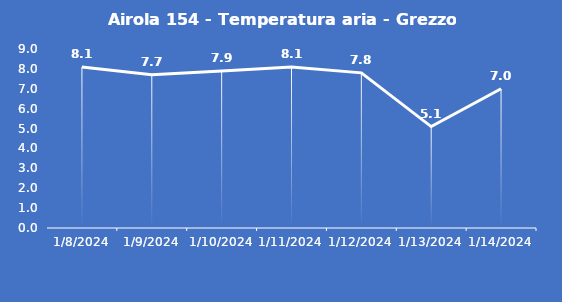
| Category | Airola 154 - Temperatura aria - Grezzo (°C) |
|---|---|
| 1/8/24 | 8.1 |
| 1/9/24 | 7.7 |
| 1/10/24 | 7.9 |
| 1/11/24 | 8.1 |
| 1/12/24 | 7.8 |
| 1/13/24 | 5.1 |
| 1/14/24 | 7 |